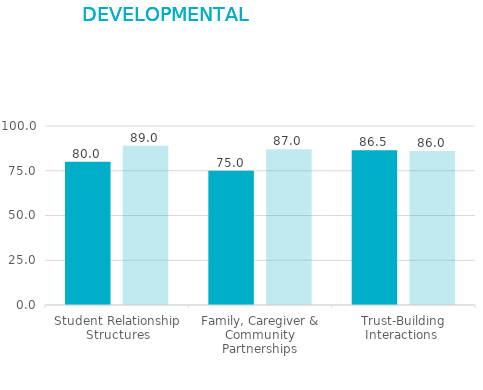
| Category | Time 1 | Time 2 |
|---|---|---|
| Student Relationship Structures | 80 | 89 |
| Family, Caregiver & Community Partnerships | 75 | 87 |
| Trust-Building Interactions  | 86.5 | 86 |